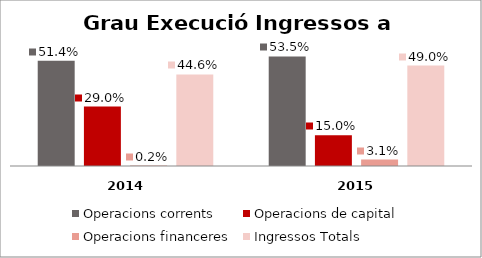
| Category | Operacions corrents | Operacions de capital | Operacions financeres | Ingressos Totals |
|---|---|---|---|---|
| 0 | 0.514 | 0.29 | 0.002 | 0.446 |
| 1 | 0.535 | 0.15 | 0.031 | 0.49 |